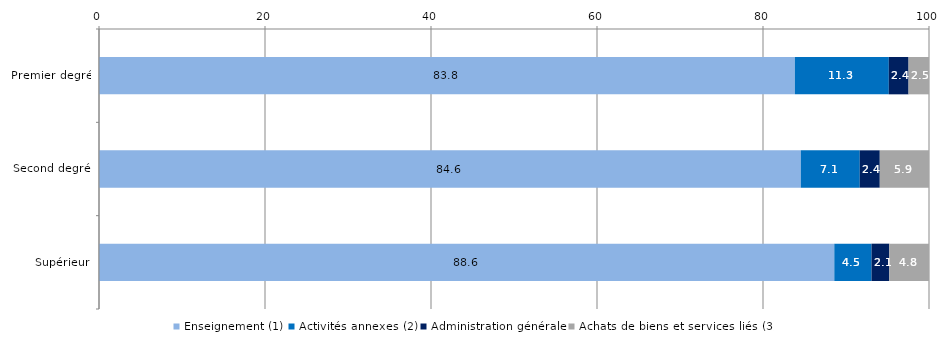
| Category | Enseignement (1) | Activités annexes (2) | Administration générale | Achats de biens et services liés (3) |
|---|---|---|---|---|
| Premier degré | 83.84 | 11.318 | 2.378 | 2.464 |
| Second degré | 84.556 | 7.101 | 2.413 | 5.929 |
| Supérieur | 88.59 | 4.486 | 2.136 | 4.788 |